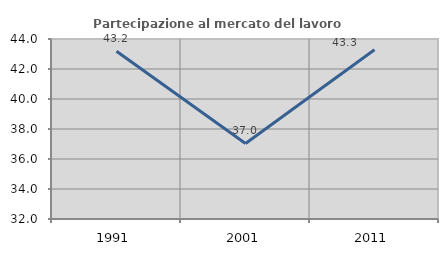
| Category | Partecipazione al mercato del lavoro  femminile |
|---|---|
| 1991.0 | 43.182 |
| 2001.0 | 37.037 |
| 2011.0 | 43.28 |